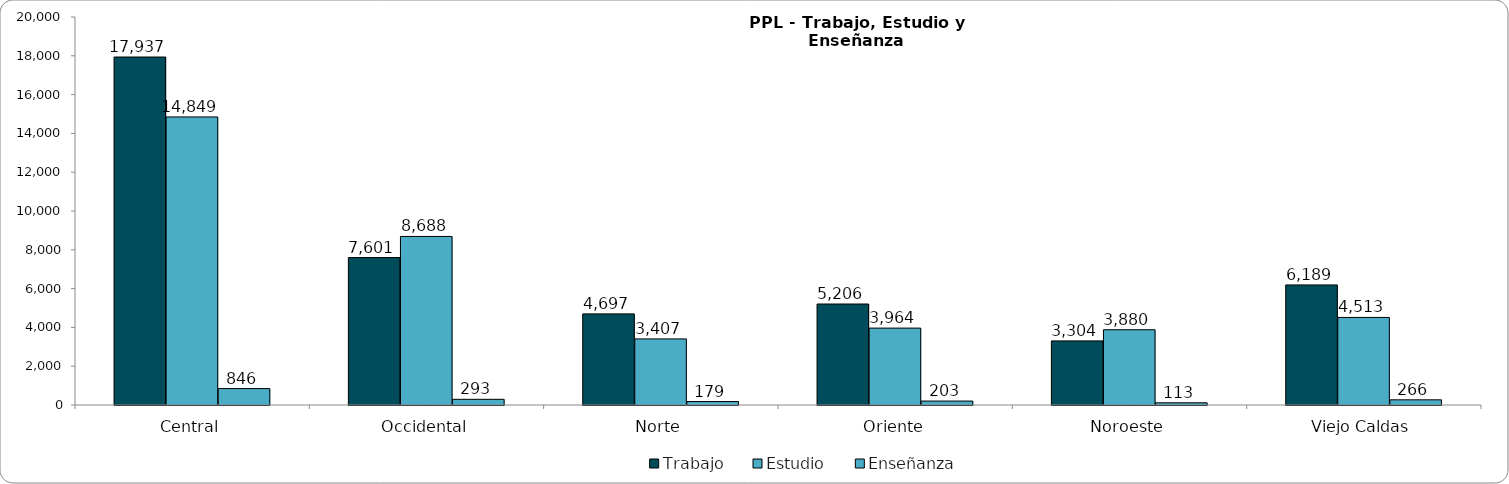
| Category | Trabajo | Estudio | Enseñanza |
|---|---|---|---|
| Central | 17937 | 14849 | 846 |
| Occidental | 7601 | 8688 | 293 |
| Norte | 4697 | 3407 | 179 |
| Oriente | 5206 | 3964 | 203 |
| Noroeste | 3304 | 3880 | 113 |
| Viejo Caldas | 6189 | 4513 | 266 |